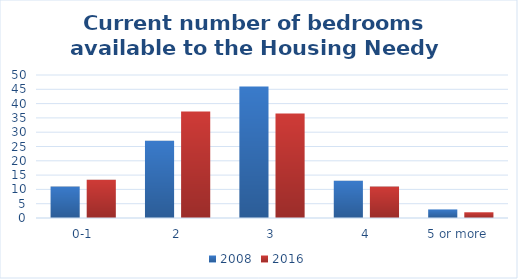
| Category | 2008 | 2016 |
|---|---|---|
| 0-1 | 11 | 13.34 |
| 2 | 27 | 37.265 |
| 3 | 46 | 36.556 |
| 4 | 13 | 11 |
| 5 or more  | 3 | 2 |